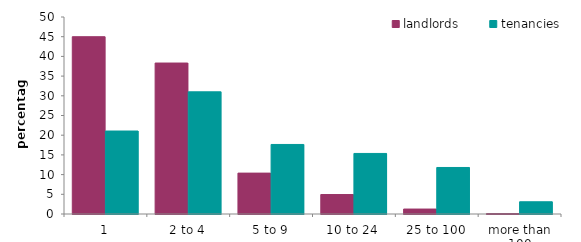
| Category | landlords | tenancies |
|---|---|---|
| 0 | 44.997 | 21.061 |
| 1 | 38.315 | 31.01 |
| 2 | 10.378 | 17.651 |
| 3 | 4.938 | 15.368 |
| 4 | 1.254 | 11.807 |
| 5 | 0.119 | 3.103 |